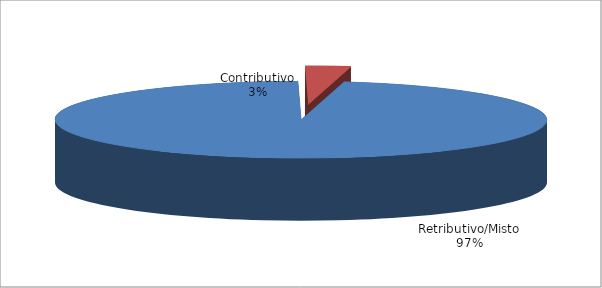
| Category | Series 1 |
|---|---|
| Retributivo/Misto | 13560 |
| Contributivo | 417 |